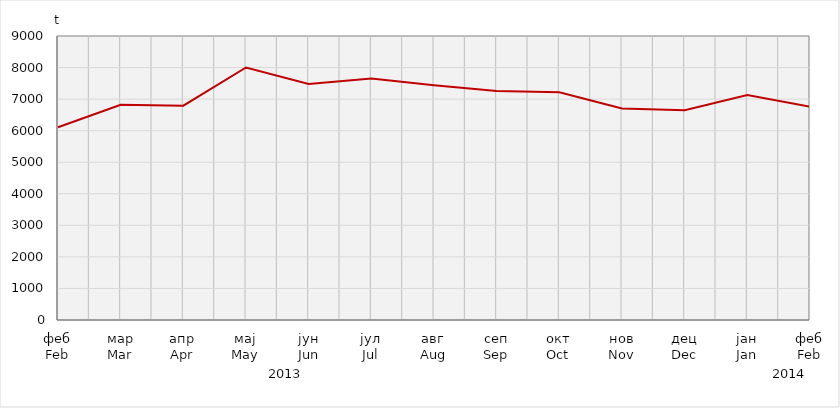
| Category | Series 0 |
|---|---|
| феб
Feb | 6110.3 |
| мар
Mar | 6817.539 |
| апр
Apr | 6791.082 |
| мај
May | 8003.083 |
| јун
Jun | 7477.208 |
| јул
Jul | 7656.3 |
| авг
Aug | 7438.817 |
| сеп
Sep | 7259.483 |
| окт
Oct | 7215.835 |
| нов
Nov | 6703.771 |
| дец
Dec | 6645.141 |
| јан
Jan | 7129.979 |
| феб
Feb | 6759.17 |